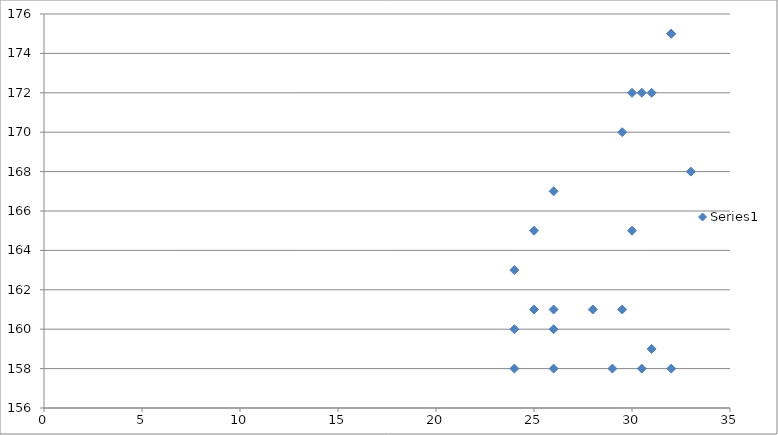
| Category | Series 0 |
|---|---|
| 29.5 | 170 |
| 29.5 | 161 |
| 30.5 | 172 |
| 24.0 | 163 |
| 25.0 | 161 |
| 25.0 | 165 |
| 32.0 | 158 |
| 33.0 | 168 |
| 32.0 | 175 |
| 26.0 | 161 |
| 24.0 | 158 |
| 30.5 | 158 |
| 26.0 | 160 |
| 32.0 | 175 |
| 29.0 | 158 |
| 30.0 | 172 |
| 26.0 | 158 |
| 28.0 | 161 |
| 26.0 | 167 |
| 24.0 | 160 |
| 30.0 | 165 |
| 31.0 | 172 |
| 31.0 | 159 |